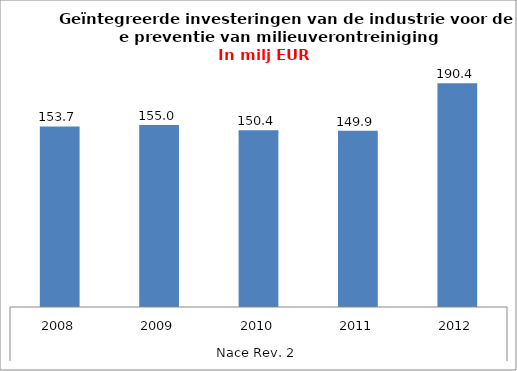
| Category | Totaal industrie |
|---|---|
| 0 | 153.7 |
| 1 | 155 |
| 2 | 150.4 |
| 3 | 149.9 |
| 4 | 190.357 |